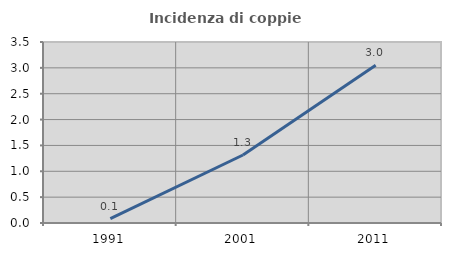
| Category | Incidenza di coppie miste |
|---|---|
| 1991.0 | 0.084 |
| 2001.0 | 1.315 |
| 2011.0 | 3.049 |